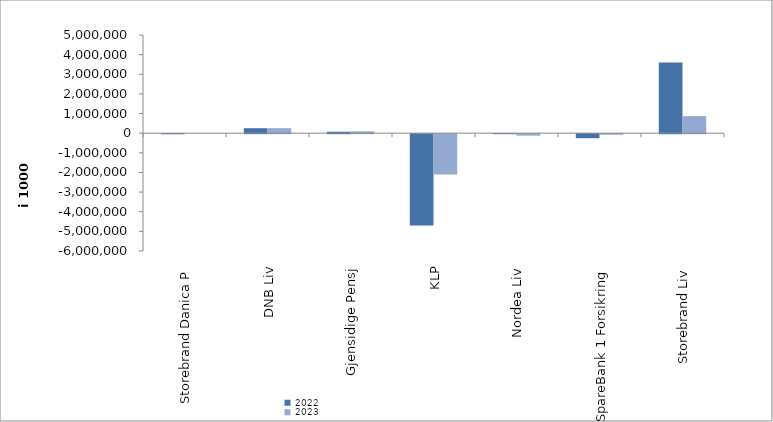
| Category | 2022 | 2023 |
|---|---|---|
| Storebrand Danica P | -4997.077 | 0 |
| DNB Liv | 253788 | 254527 |
| Gjensidige Pensj | 74640 | 92671 |
| KLP | -4649405.993 | -2047522.941 |
| Nordea Liv | -1634.948 | -76995.756 |
| SpareBank 1 Forsikring | -204154 | -28286.632 |
| Storebrand Liv | 3595002.943 | 866718.982 |